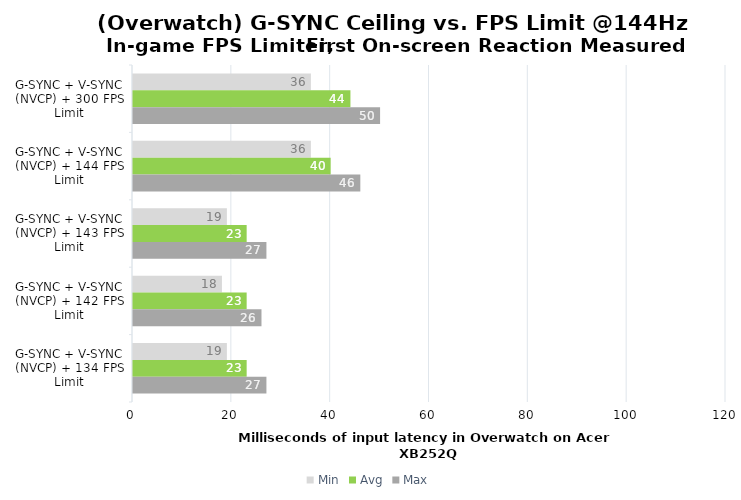
| Category | Min | Avg | Max |
|---|---|---|---|
| G-SYNC + V-SYNC (NVCP) + 300 FPS Limit | 36 | 44 | 50 |
| G-SYNC + V-SYNC (NVCP) + 144 FPS Limit | 36 | 40 | 46 |
| G-SYNC + V-SYNC (NVCP) + 143 FPS Limit | 19 | 23 | 27 |
| G-SYNC + V-SYNC (NVCP) + 142 FPS Limit | 18 | 23 | 26 |
| G-SYNC + V-SYNC (NVCP) + 134 FPS Limit | 19 | 23 | 27 |